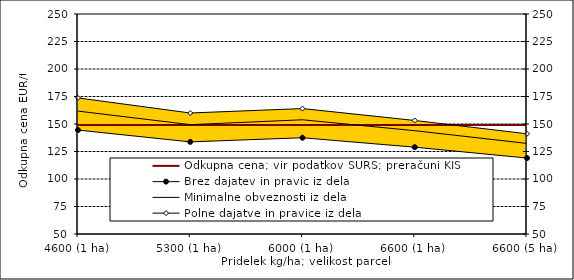
| Category | Odkupna cena; vir podatkov SURS; preračuni KIS |
|---|---|
| 4600 (1ha) | 149 |
| 5300 (1ha) | 149 |
| 6000 (1ha) | 149 |
| 6600 (1ha) | 149 |
| 6600 (5ha) | 149 |